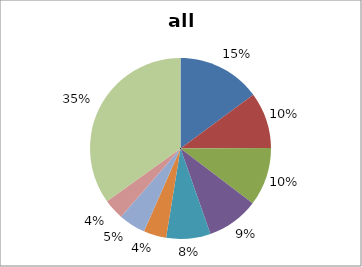
| Category | Series 0 |
|---|---|
| protein metabolism | 4988 |
| misc | 3368 |
| RNA | 3500 |
| DNA | 3122 |
| metabolism | 2652 |
| signalling | 1363 |
| cell division and development | 1618 |
| stress | 1228 |
| not assigned | 11714 |